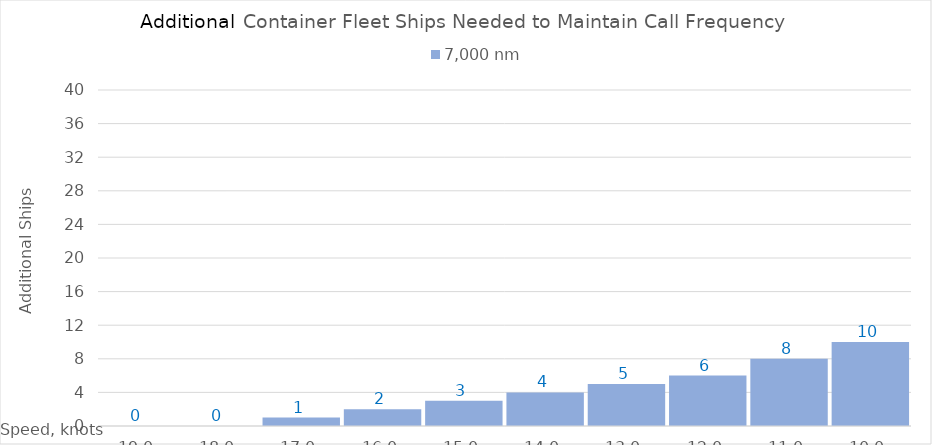
| Category | 7,000 |
|---|---|
| 19.0 | 0 |
| 18.0 | 0 |
| 17.0 | 1 |
| 16.0 | 2 |
| 15.0 | 3 |
| 14.0 | 4 |
| 13.0 | 5 |
| 12.0 | 6 |
| 11.0 | 8 |
| 10.0 | 10 |